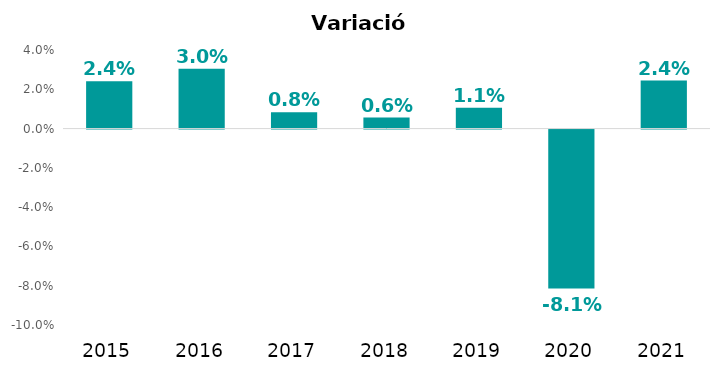
| Category | Variació interanual |
|---|---|
| 2015.0 | 0.024 |
| 2016.0 | 0.03 |
| 2017.0 | 0.008 |
| 2018.0 | 0.006 |
| 2019.0 | 0.011 |
| 2020.0 | -0.081 |
| 2021.0 | 0.024 |